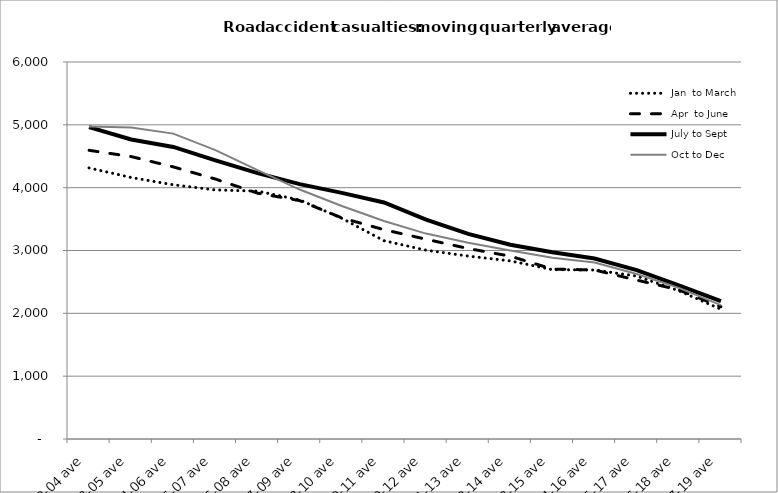
| Category | Jan  to March | Apr  to June | July to Sept | Oct to Dec |
|---|---|---|---|---|
| 2002-04 ave | 4314 | 4594.667 | 4963 | 4972.667 |
| 2003-05 ave | 4161.667 | 4494.667 | 4766 | 4958.667 |
| 2004-06 ave | 4046 | 4330.667 | 4648.667 | 4860 |
| 2005-07 ave | 3963.667 | 4137 | 4433 | 4597.333 |
| 2006-08 ave | 3945 | 3912.333 | 4231.667 | 4277.667 |
| 2007-09 ave | 3804.667 | 3793.667 | 4056.333 | 3970 |
| 2008-10 ave | 3512.667 | 3519 | 3917.667 | 3708.333 |
| 2009-11 ave | 3156.333 | 3331.333 | 3764.333 | 3470 |
| 2010-12 ave | 3004.333 | 3179.333 | 3492.333 | 3269 |
| 2011-13 ave | 2911.333 | 3031.333 | 3265 | 3122 |
| 2012-14 ave | 2834.333 | 2910 | 3091 | 3000 |
| 2013-15 ave | 2695.333 | 2704.333 | 2973.667 | 2883.667 |
| 2014-16 ave | 2689.333 | 2690 | 2872 | 2807.667 |
| 2015-17 ave | 2593.333 | 2529 | 2688.333 | 2625.333 |
| 2016-18 ave | 2359.333 | 2374 | 2446.333 | 2405.333 |
| 2017-19 ave | 2065.333 | 2105.333 | 2196 | 2131.667 |